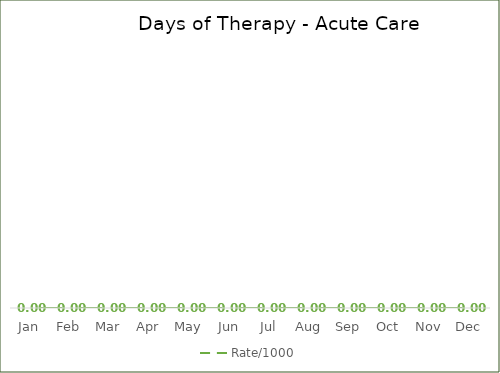
| Category | Rate/1000 |
|---|---|
| Jan | 0 |
| Feb | 0 |
| Mar | 0 |
| Apr | 0 |
| May | 0 |
| Jun | 0 |
| Jul | 0 |
| Aug | 0 |
| Sep | 0 |
| Oct | 0 |
| Nov | 0 |
| Dec | 0 |